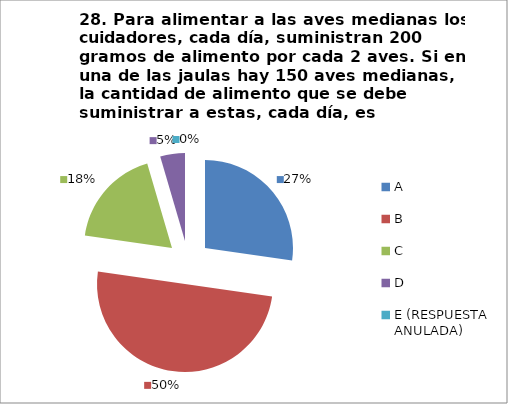
| Category | CANTIDAD DE RESPUESTAS PREGUNTA (28) | PORCENTAJE |
|---|---|---|
| A | 6 | 0.273 |
| B | 11 | 0.5 |
| C | 4 | 0.182 |
| D | 1 | 0.045 |
| E (RESPUESTA ANULADA) | 0 | 0 |